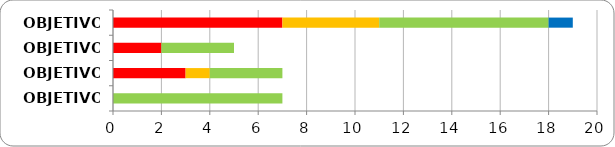
| Category | Series 0 | Series 1 | Series 2 | Series 3 | Series 4 |
|---|---|---|---|---|---|
| OBJETIVO 1 | 0 | 7 | 4 | 7 | 1 |
| OBJETIVO 2 | 0 | 2 | 0 | 3 | 0 |
| OBJETIVO 3 | 0 | 3 | 1 | 3 | 0 |
| OBJETIVO 4 | 0 | 0 | 0 | 7 | 0 |